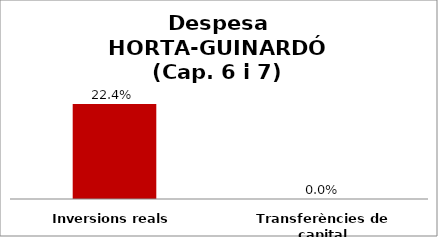
| Category | Series 0 |
|---|---|
| Inversions reals | 0.224 |
| Transferències de capital | 0 |